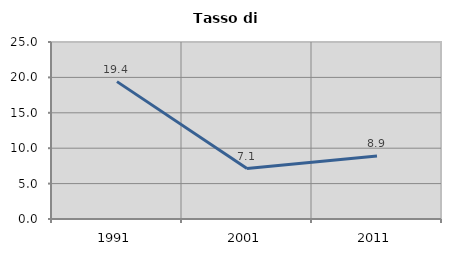
| Category | Tasso di disoccupazione   |
|---|---|
| 1991.0 | 19.403 |
| 2001.0 | 7.127 |
| 2011.0 | 8.894 |